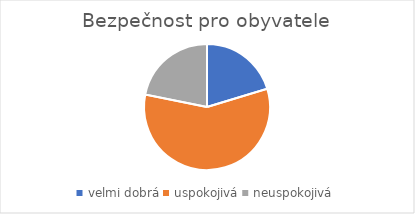
| Category | Bezpečnost pro obyvatele |
|---|---|
| velmi dobrá | 53 |
| uspokojivá | 151 |
| neuspokojivá | 57 |